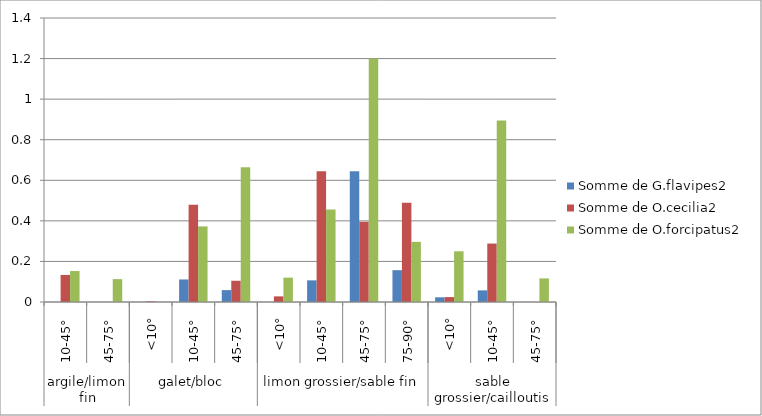
| Category | Somme de G.flavipes2 | Somme de O.cecilia2 | Somme de O.forcipatus2 |
|---|---|---|---|
| 0 | 0 | 0.133 | 0.153 |
| 1 | 0 | 0 | 0.113 |
| 2 | 0 | 0.003 | 0 |
| 3 | 0.111 | 0.479 | 0.373 |
| 4 | 0.059 | 0.105 | 0.664 |
| 5 | 0 | 0.028 | 0.12 |
| 6 | 0.107 | 0.644 | 0.456 |
| 7 | 0.645 | 0.396 | 1.201 |
| 8 | 0.157 | 0.49 | 0.297 |
| 9 | 0.023 | 0.024 | 0.25 |
| 10 | 0.057 | 0.288 | 0.895 |
| 11 | 0 | 0 | 0.116 |